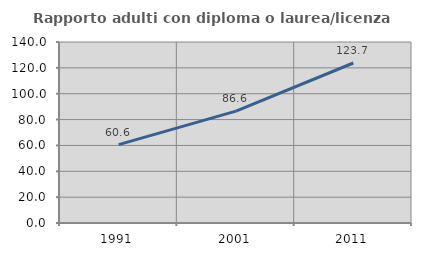
| Category | Rapporto adulti con diploma o laurea/licenza media  |
|---|---|
| 1991.0 | 60.63 |
| 2001.0 | 86.558 |
| 2011.0 | 123.747 |